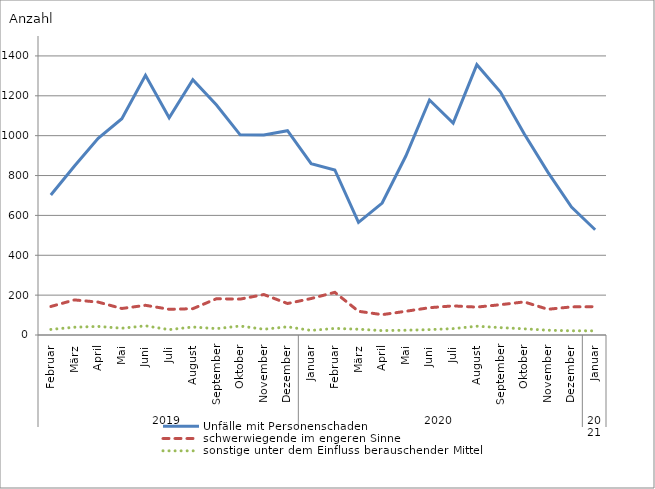
| Category | Unfälle mit Personenschaden | schwerwiegende im engeren Sinne | sonstige unter dem Einfluss berauschender Mittel |
|---|---|---|---|
| 0 | 702 | 143 | 28 |
| 1 | 848 | 176 | 39 |
| 2 | 987 | 165 | 43 |
| 3 | 1085 | 133 | 34 |
| 4 | 1303 | 149 | 46 |
| 5 | 1090 | 129 | 27 |
| 6 | 1281 | 132 | 40 |
| 7 | 1154 | 182 | 32 |
| 8 | 1004 | 180 | 45 |
| 9 | 1003 | 203 | 29 |
| 10 | 1025 | 158 | 41 |
| 11 | 860 | 183 | 23 |
| 12 | 828 | 214 | 33 |
| 13 | 565 | 119 | 29 |
| 14 | 662 | 102 | 22 |
| 15 | 898 | 119 | 24 |
| 16 | 1179 | 137 | 27 |
| 17 | 1063 | 146 | 32 |
| 18 | 1356 | 140 | 44 |
| 19 | 1219 | 152 | 37 |
| 20 | 1010 | 166 | 31 |
| 21 | 817 | 129 | 24 |
| 22 | 642 | 141 | 21 |
| 23 | 528 | 142 | 21 |